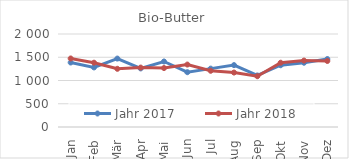
| Category | Jahr 2017 | Jahr 2018 |
|---|---|---|
| Jan | 1387.046 | 1473.752 |
| Feb | 1280.941 | 1382.972 |
| Mär | 1471.445 | 1251.355 |
| Apr | 1259.7 | 1277.817 |
| Mai | 1409.086 | 1267.655 |
| Jun | 1178.607 | 1342.961 |
| Jul | 1255.331 | 1208.89 |
| Aug | 1330.551 | 1170.983 |
| Sep | 1108.327 | 1092.155 |
| Okt | 1328.149 | 1382.484 |
| Nov | 1382.377 | 1428.328 |
| Dez | 1461.076 | 1419.626 |